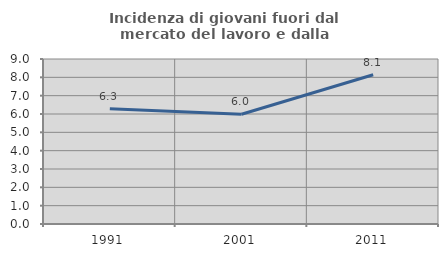
| Category | Incidenza di giovani fuori dal mercato del lavoro e dalla formazione  |
|---|---|
| 1991.0 | 6.292 |
| 2001.0 | 5.985 |
| 2011.0 | 8.142 |